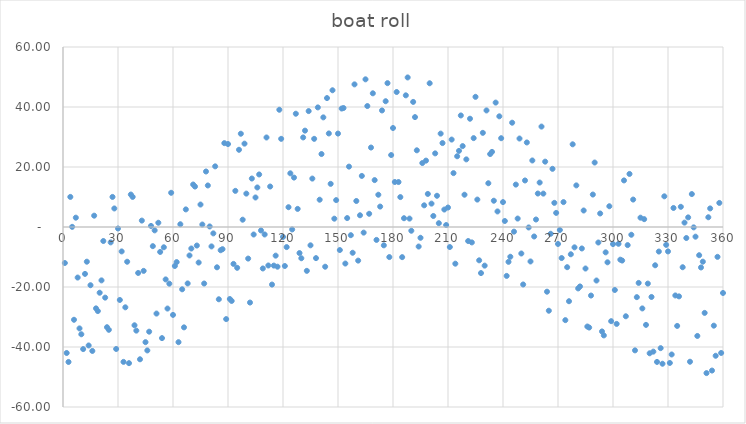
| Category | Series 0 |
|---|---|
| 0 | -12 |
| 1 | -41.997 |
| 2 | -44.988 |
| 3 | 10.027 |
| 4 | 0.049 |
| 5 | -30.924 |
| 6 | 3.11 |
| 7 | -16.851 |
| 8 | -33.805 |
| 9 | -35.754 |
| 10 | -40.696 |
| 11 | -15.633 |
| 12 | -11.563 |
| 13 | -39.487 |
| 14 | -19.406 |
| 15 | -41.319 |
| 16 | 3.775 |
| 17 | -27.126 |
| 18 | -28.021 |
| 19 | -21.91 |
| 20 | -17.794 |
| 21 | -4.672 |
| 22 | -23.544 |
| 23 | -33.41 |
| 24 | -34.271 |
| 25 | -5.126 |
| 26 | 10.024 |
| 27 | 6.18 |
| 28 | -40.659 |
| 29 | -0.492 |
| 30 | -24.321 |
| 31 | -8.143 |
| 32 | -44.961 |
| 33 | -26.773 |
| 34 | -11.581 |
| 35 | -45.383 |
| 36 | 10.82 |
| 37 | 10.027 |
| 38 | -32.76 |
| 39 | -34.543 |
| 40 | -15.321 |
| 41 | -44.094 |
| 42 | 2.137 |
| 43 | -14.627 |
| 44 | -38.387 |
| 45 | -41.142 |
| 46 | -34.893 |
| 47 | 0.36 |
| 48 | -6.383 |
| 49 | -1.121 |
| 50 | -28.856 |
| 51 | 1.414 |
| 52 | -8.313 |
| 53 | -37.036 |
| 54 | -6.756 |
| 55 | -17.472 |
| 56 | -27.184 |
| 57 | -18.893 |
| 58 | 11.402 |
| 59 | -29.301 |
| 60 | -13 |
| 61 | -11.696 |
| 62 | -38.389 |
| 63 | 0.92 |
| 64 | -20.767 |
| 65 | -33.452 |
| 66 | 5.865 |
| 67 | -18.815 |
| 68 | -9.492 |
| 69 | -7.167 |
| 70 | 14.16 |
| 71 | 13.489 |
| 72 | -6.18 |
| 73 | -11.847 |
| 74 | 7.487 |
| 75 | 0.824 |
| 76 | -18.838 |
| 77 | 18.501 |
| 78 | 13.842 |
| 79 | 0.184 |
| 80 | -6.473 |
| 81 | -2.129 |
| 82 | 20.217 |
| 83 | -13.437 |
| 84 | -24.091 |
| 85 | -7.743 |
| 86 | -7.395 |
| 87 | 27.953 |
| 88 | -30.698 |
| 89 | 27.651 |
| 90 | -24 |
| 91 | -24.651 |
| 92 | -12.302 |
| 93 | 12.047 |
| 94 | -13.605 |
| 95 | 25.743 |
| 96 | 31.091 |
| 97 | 2.437 |
| 98 | 27.783 |
| 99 | 11.129 |
| 100 | -10.527 |
| 101 | -25.184 |
| 102 | 16.158 |
| 103 | -2.501 |
| 104 | 9.838 |
| 105 | 13.176 |
| 106 | 17.513 |
| 107 | -1.153 |
| 108 | -13.82 |
| 109 | -2.489 |
| 110 | 29.84 |
| 111 | -12.833 |
| 112 | 13.492 |
| 113 | -19.185 |
| 114 | -12.865 |
| 115 | -9.548 |
| 116 | -13.233 |
| 117 | 39.08 |
| 118 | 29.389 |
| 119 | -3.304 |
| 120 | -13 |
| 121 | -6.699 |
| 122 | 6.598 |
| 123 | 17.893 |
| 124 | -0.816 |
| 125 | 16.472 |
| 126 | 37.756 |
| 127 | 6.036 |
| 128 | -8.687 |
| 129 | -10.414 |
| 130 | 29.856 |
| 131 | 32.121 |
| 132 | -14.617 |
| 133 | 38.64 |
| 134 | -6.107 |
| 135 | 16.142 |
| 136 | 29.387 |
| 137 | -10.373 |
| 138 | 39.863 |
| 139 | 9.094 |
| 140 | 24.321 |
| 141 | 36.543 |
| 142 | -13.24 |
| 143 | 42.973 |
| 144 | 31.18 |
| 145 | 14.383 |
| 146 | 45.581 |
| 147 | 2.773 |
| 148 | 8.961 |
| 149 | 31.143 |
| 150 | -7.679 |
| 151 | 39.492 |
| 152 | 39.659 |
| 153 | -12.18 |
| 154 | 2.976 |
| 155 | 20.126 |
| 156 | -2.729 |
| 157 | -8.59 |
| 158 | 47.544 |
| 159 | 8.672 |
| 160 | -11.206 |
| 161 | 3.91 |
| 162 | 17.021 |
| 163 | -1.874 |
| 164 | 49.225 |
| 165 | 40.319 |
| 166 | 4.406 |
| 167 | 26.487 |
| 168 | 44.563 |
| 169 | 15.633 |
| 170 | -4.304 |
| 171 | 10.754 |
| 172 | 6.805 |
| 173 | 38.851 |
| 174 | -6.11 |
| 175 | 41.924 |
| 176 | 47.951 |
| 177 | -10.027 |
| 178 | 23.988 |
| 179 | 32.997 |
| 180 | 15 |
| 181 | 44.997 |
| 182 | 14.988 |
| 183 | 9.973 |
| 184 | -10.049 |
| 185 | 2.924 |
| 186 | 43.89 |
| 187 | 49.851 |
| 188 | 2.805 |
| 189 | -1.246 |
| 190 | 41.696 |
| 191 | 36.633 |
| 192 | 25.563 |
| 193 | -6.513 |
| 194 | -3.594 |
| 195 | 21.319 |
| 196 | 7.225 |
| 197 | 22.126 |
| 198 | 11.021 |
| 199 | 47.91 |
| 200 | 7.794 |
| 201 | 3.672 |
| 202 | 24.544 |
| 203 | 10.41 |
| 204 | 1.271 |
| 205 | 31.126 |
| 206 | 27.976 |
| 207 | 5.82 |
| 208 | 0.659 |
| 209 | 6.492 |
| 210 | -6.679 |
| 211 | 29.143 |
| 212 | 17.961 |
| 213 | -12.227 |
| 214 | 23.581 |
| 215 | 25.383 |
| 216 | 37.18 |
| 217 | 26.973 |
| 218 | 10.76 |
| 219 | 22.543 |
| 220 | -4.679 |
| 221 | 36.094 |
| 222 | -5.137 |
| 223 | 29.627 |
| 224 | 43.387 |
| 225 | 9.142 |
| 226 | -11.107 |
| 227 | -15.36 |
| 228 | 31.383 |
| 229 | -12.879 |
| 230 | 38.856 |
| 231 | 14.586 |
| 232 | 24.313 |
| 233 | 25.036 |
| 234 | 8.756 |
| 235 | 41.472 |
| 236 | 5.184 |
| 237 | 36.893 |
| 238 | 29.598 |
| 239 | 8.301 |
| 240 | 2 |
| 241 | -16.304 |
| 242 | -11.611 |
| 243 | -9.92 |
| 244 | 34.767 |
| 245 | -1.548 |
| 246 | 14.135 |
| 247 | 2.815 |
| 248 | 29.492 |
| 249 | -8.833 |
| 250 | -19.16 |
| 251 | 15.511 |
| 252 | 28.18 |
| 253 | -0.153 |
| 254 | -11.487 |
| 255 | 22.176 |
| 256 | -3.162 |
| 257 | 2.499 |
| 258 | 11.158 |
| 259 | 14.816 |
| 260 | 33.473 |
| 261 | 11.129 |
| 262 | 21.783 |
| 263 | -21.563 |
| 264 | -27.909 |
| 265 | -2.257 |
| 266 | 19.395 |
| 267 | 8.047 |
| 268 | 4.698 |
| 269 | -5.651 |
| 270 | -1 |
| 271 | -10.349 |
| 272 | 8.302 |
| 273 | -31.047 |
| 274 | -13.395 |
| 275 | -24.743 |
| 276 | -9.091 |
| 277 | 27.563 |
| 278 | -6.783 |
| 279 | 13.871 |
| 280 | -20.473 |
| 281 | -19.816 |
| 282 | -7.158 |
| 283 | 5.501 |
| 284 | -13.838 |
| 285 | -33.176 |
| 286 | -33.513 |
| 287 | -22.847 |
| 288 | 10.82 |
| 289 | 21.489 |
| 290 | -17.84 |
| 291 | -5.167 |
| 292 | 4.508 |
| 293 | -34.815 |
| 294 | -36.135 |
| 295 | -8.452 |
| 296 | -11.767 |
| 297 | 6.92 |
| 298 | -31.389 |
| 299 | -5.696 |
| 300 | -21 |
| 301 | -32.301 |
| 302 | -5.598 |
| 303 | -10.893 |
| 304 | -11.184 |
| 305 | 15.528 |
| 306 | -29.756 |
| 307 | -6.036 |
| 308 | 17.687 |
| 309 | -2.586 |
| 310 | 9.144 |
| 311 | -41.121 |
| 312 | -23.383 |
| 313 | -18.64 |
| 314 | 3.107 |
| 315 | -27.142 |
| 316 | 2.613 |
| 317 | -32.627 |
| 318 | -18.863 |
| 319 | -42.094 |
| 320 | -23.321 |
| 321 | -41.543 |
| 322 | -12.76 |
| 323 | -44.973 |
| 324 | -8.18 |
| 325 | -40.383 |
| 326 | -45.581 |
| 327 | 10.227 |
| 328 | -5.961 |
| 329 | -8.143 |
| 330 | -45.321 |
| 331 | -42.492 |
| 332 | 6.341 |
| 333 | -22.82 |
| 334 | -32.976 |
| 335 | -23.126 |
| 336 | 6.729 |
| 337 | -13.41 |
| 338 | 1.456 |
| 339 | -3.672 |
| 340 | 3.206 |
| 341 | -44.91 |
| 342 | 10.979 |
| 343 | -0.126 |
| 344 | -3.225 |
| 345 | -36.319 |
| 346 | -9.406 |
| 347 | -13.487 |
| 348 | -11.563 |
| 349 | -28.633 |
| 350 | -48.696 |
| 351 | 3.246 |
| 352 | 6.195 |
| 353 | -47.851 |
| 354 | -32.89 |
| 355 | -42.924 |
| 356 | -9.951 |
| 357 | 8.027 |
| 358 | -41.988 |
| 359 | -21.997 |
| 360 | -36 |